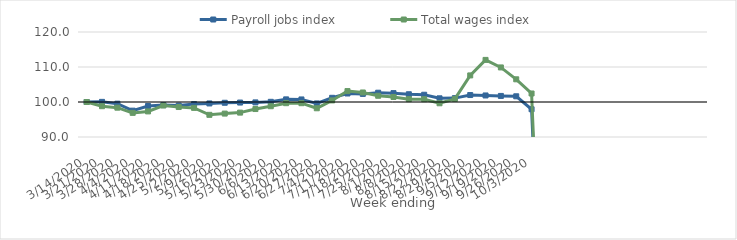
| Category | Payroll jobs index | Total wages index |
|---|---|---|
| 14/03/2020 | 100 | 100 |
| 21/03/2020 | 100.037 | 98.8 |
| 28/03/2020 | 99.527 | 98.378 |
| 04/04/2020 | 97.528 | 96.894 |
| 11/04/2020 | 98.863 | 97.311 |
| 18/04/2020 | 99.114 | 98.999 |
| 25/04/2020 | 98.974 | 98.563 |
| 02/05/2020 | 99.394 | 98.319 |
| 09/05/2020 | 99.586 | 96.331 |
| 16/05/2020 | 99.781 | 96.69 |
| 23/05/2020 | 99.84 | 96.966 |
| 30/05/2020 | 99.888 | 97.988 |
| 06/06/2020 | 100.05 | 98.792 |
| 13/06/2020 | 100.751 | 99.663 |
| 20/06/2020 | 100.73 | 99.659 |
| 27/06/2020 | 99.594 | 98.209 |
| 04/07/2020 | 101.2 | 100.452 |
| 11/07/2020 | 102.429 | 103.12 |
| 18/07/2020 | 102.316 | 102.722 |
| 25/07/2020 | 102.653 | 101.781 |
| 01/08/2020 | 102.534 | 101.432 |
| 08/08/2020 | 102.216 | 100.816 |
| 15/08/2020 | 102.075 | 100.803 |
| 22/08/2020 | 101.052 | 99.636 |
| 29/08/2020 | 101.109 | 100.89 |
| 05/09/2020 | 101.987 | 107.598 |
| 12/09/2020 | 101.869 | 112.031 |
| 19/09/2020 | 101.735 | 109.878 |
| 26/09/2020 | 101.632 | 106.485 |
| 03/10/2020 | 97.931 | 102.431 |